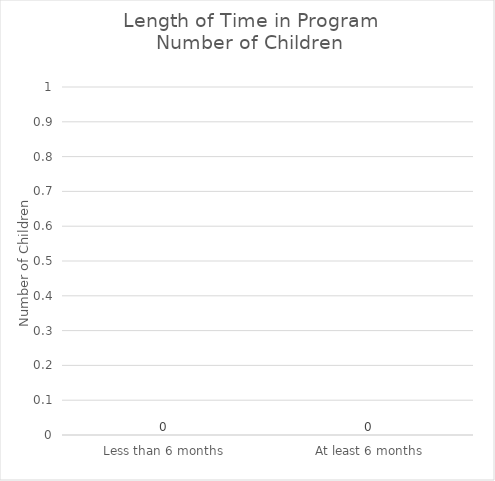
| Category | Number of Children |
|---|---|
| Less than 6 months | 0 |
| At least 6 months | 0 |